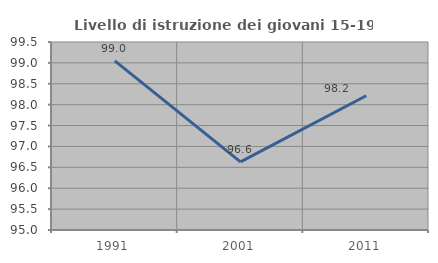
| Category | Livello di istruzione dei giovani 15-19 anni |
|---|---|
| 1991.0 | 99.048 |
| 2001.0 | 96.629 |
| 2011.0 | 98.214 |